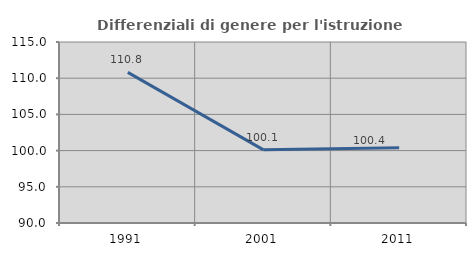
| Category | Differenziali di genere per l'istruzione superiore |
|---|---|
| 1991.0 | 110.81 |
| 2001.0 | 100.107 |
| 2011.0 | 100.397 |